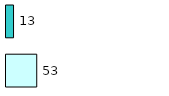
| Category | Series 0 | Series 1 |
|---|---|---|
| 0 | 53 | 13 |